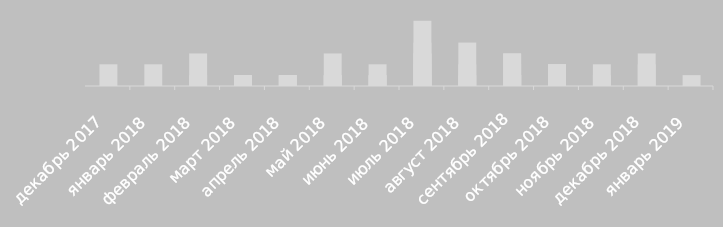
| Category | Series 0 |
|---|---|
| 2017-12-29 | 2 |
| 2018-01-25 | 2 |
| 2018-02-01 | 3 |
| 2018-02-21 | 1 |
| 2018-03-20 | 1 |
| 2018-03-28 | 1 |
| 2018-03-29 | 1 |
| 2018-04-02 | 1 |
| 2018-04-15 | 1 |
| 2018-04-25 | 1 |
| 2018-04-28 | 1 |
| 2018-04-30 | 1 |
| 2018-05-03 | 3 |
| 2018-05-25 | 1 |
| 2018-05-30 | 1 |
| 2018-06-01 | 2 |
| 2018-06-16 | 1 |
| 2018-06-30 | 1 |
| 2018-07-14 | 6 |
| 2018-07-17 | 1 |
| 2018-07-25 | 2 |
| 2018-07-28 | 4 |
| 2018-07-30 | 3 |
| 2018-07-31 | 3 |
| 2018-08-10 | 1 |
| 2018-08-11 | 4 |
| 2018-08-15 | 2 |
| 2018-09-01 | 3 |
| 2018-09-04 | 1 |
| 2018-09-07 | 1 |
| 2018-09-09 | 1 |
| 2018-09-15 | 1 |
| 2018-09-22 | 2 |
| 2018-09-29 | 3 |
| 2018-10-02 | 1 |
| 2018-10-16 | 1 |
| 2018-10-25 | 2 |
| 2018-10-29 | 1 |
| 2018-10-30 | 2 |
| 2018-10-31 | 2 |
| 2018-11-01 | 2 |
| 2018-11-19 | 1 |
| 2018-12-03 | 3 |
| 2018-12-29 | 2 |
| 2019-01-30 | 1 |